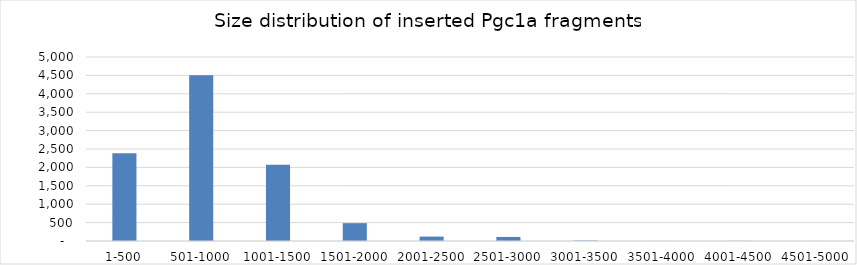
| Category | Number of inserts (Pgc1a) |
|---|---|
| 1-500 | 2387 |
| 501-1000 | 4505 |
| 1001-1500 | 2069 |
| 1501-2000 | 485 |
| 2001-2500 | 120 |
| 2501-3000 | 110 |
| 3001-3500 | 12 |
| 3501-4000 | 1 |
| 4001-4500 | 4 |
| 4501-5000 | 1 |